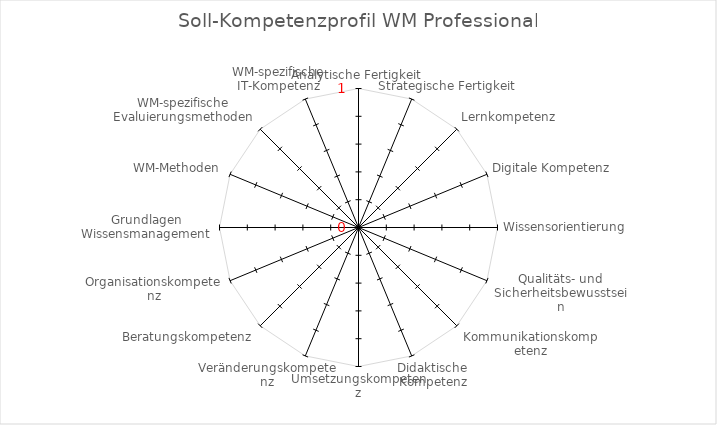
| Category | Soll-Profil | Ist-Profil |
|---|---|---|
| Analytische Fertigkeit | 0 | 0 |
| Strategische Fertigkeit | 0 | 0 |
| Lernkompetenz | 0 | 0 |
| Digitale Kompetenz | 0 | 0 |
| Wissensorientierung | 0 | 0 |
| Qualitäts- und Sicherheitsbewusstsein | 0 | 0 |
| Kommunikationskompetenz | 0 | 0 |
| Didaktische Kompetenz | 0 | 0 |
| Umsetzungskompetenz | 0 | 0 |
| Veränderungskompetenz | 0 | 0 |
| Beratungskompetenz | 0 | 0 |
| Organisationskompetenz | 0 | 0 |
| Grundlagen Wissensmanagement | 0 | 0 |
| WM-Methoden | 0 | 0 |
| WM-spezifische Evaluierungsmethoden | 0 | 0 |
| WM-spezifische IT-Kompetenz | 0 | 0 |